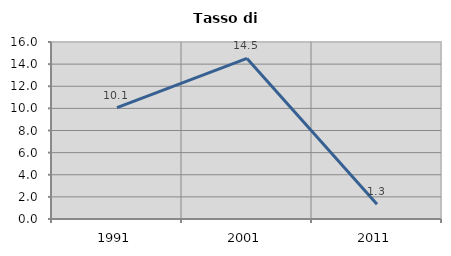
| Category | Tasso di disoccupazione   |
|---|---|
| 1991.0 | 10.067 |
| 2001.0 | 14.516 |
| 2011.0 | 1.342 |